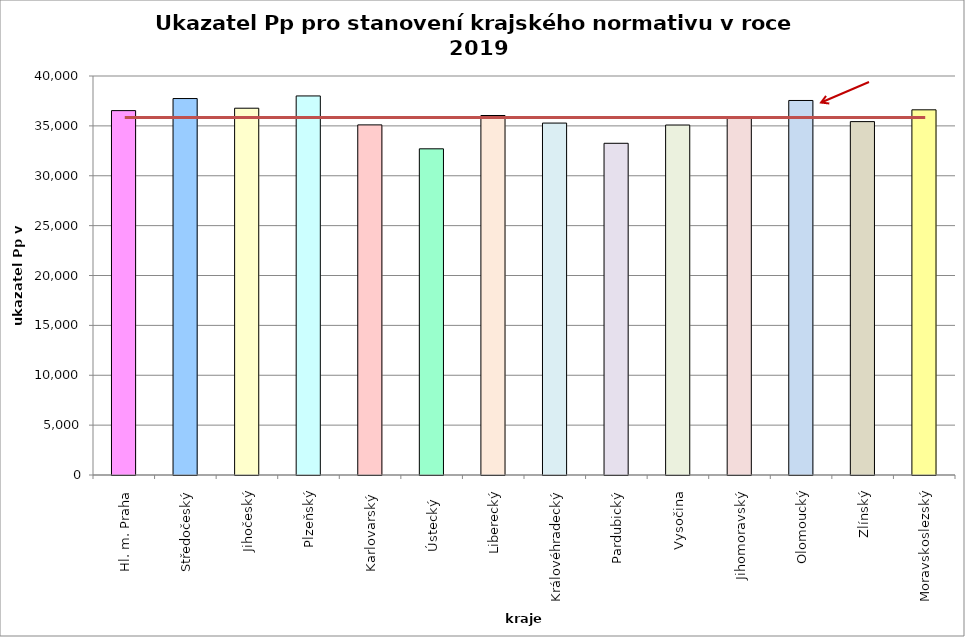
| Category | Series 0 |
|---|---|
| Hl. m. Praha | 36530 |
| Středočeský | 37740 |
| Jihočeský | 36771 |
| Plzeňský | 38000 |
| Karlovarský  | 35100 |
| Ústecký   | 32700 |
| Liberecký | 36040 |
| Královéhradecký | 35281 |
| Pardubický | 33254 |
| Vysočina | 35086 |
| Jihomoravský | 35755 |
| Olomoucký | 37546 |
| Zlínský | 35427 |
| Moravskoslezský | 36610 |